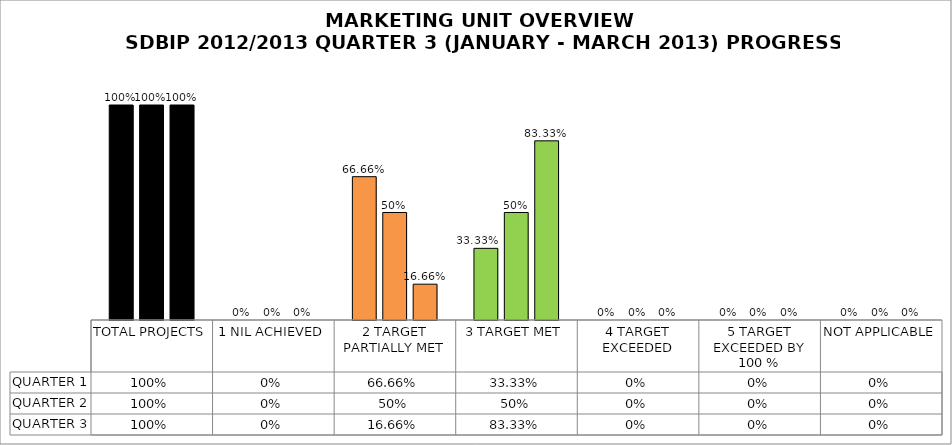
| Category | QUARTER 1 | QUARTER 2 | QUARTER 3 |
|---|---|---|---|
| TOTAL PROJECTS | 1 | 1 | 1 |
| 1 NIL ACHIEVED | 0 | 0 | 0 |
| 2 TARGET PARTIALLY MET | 0.667 | 0.5 | 0.167 |
| 3 TARGET MET | 0.333 | 0.5 | 0.833 |
| 4 TARGET EXCEEDED | 0 | 0 | 0 |
| 5 TARGET EXCEEDED BY 100 % | 0 | 0 | 0 |
| NOT APPLICABLE | 0 | 0 | 0 |